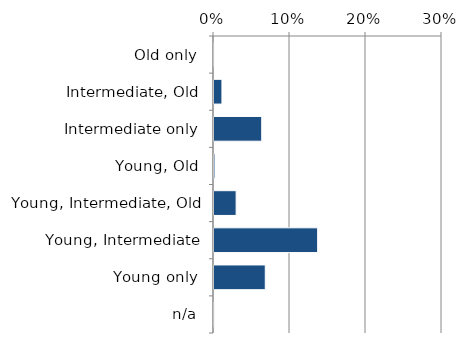
| Category | Native |
|---|---|
| n/a | 0.002 |
| Young only | 0.069 |
| Young, Intermediate | 0.138 |
| Young, Intermediate, Old | 0.03 |
| Young, Old | 0.003 |
| Intermediate only | 0.064 |
| Intermediate, Old | 0.012 |
| Old only | 0.002 |